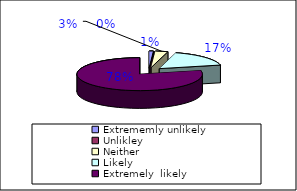
| Category | Would you recommend us to your friends and family |
|---|---|
| Extrememly unlikely | 1 |
| Unlikley | 0 |
| Neither | 3 |
| Likely | 16 |
| Extremely  likely  | 73 |